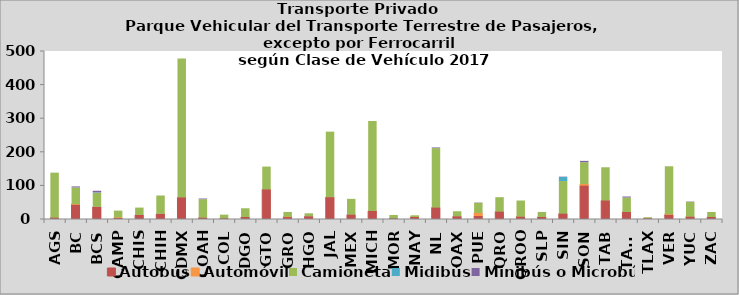
| Category | Autobús | Automóvil | Camioneta | Midibús | Minibús o Microbús |
|---|---|---|---|---|---|
| AGS | 4 | 0 | 134 | 0 | 0 |
| BC | 43 | 1 | 50 | 0 | 3 |
| BCS | 36 | 0 | 42 | 1 | 5 |
| CAMP | 3 | 2 | 20 | 0 | 0 |
| CHIS | 12 | 0 | 22 | 0 | 0 |
| CHIH | 15 | 0 | 55 | 0 | 0 |
| CDMX | 64 | 0 | 414 | 0 | 0 |
| COAH | 4 | 0 | 55 | 0 | 2 |
| COL | 2 | 0 | 11 | 0 | 0 |
| DGO | 6 | 0 | 26 | 0 | 0 |
| GTO | 88 | 0 | 68 | 0 | 0 |
| GRO | 6 | 1 | 14 | 0 | 0 |
| HGO | 8 | 0 | 9 | 0 | 0 |
| JAL | 65 | 0 | 195 | 0 | 0 |
| MEX | 13 | 0 | 47 | 0 | 0 |
| MICH | 24 | 0 | 268 | 0 | 0 |
| MOR | 2 | 0 | 10 | 0 | 0 |
| NAY | 6 | 0 | 5 | 0 | 0 |
| NL | 34 | 0 | 177 | 0 | 2 |
| OAX | 8 | 0 | 15 | 0 | 0 |
| PUE | 9 | 9 | 30 | 0 | 1 |
| QRO | 22 | 0 | 43 | 0 | 0 |
| QROO | 7 | 0 | 48 | 0 | 0 |
| SLP | 6 | 0 | 15 | 0 | 0 |
| SIN | 16 | 0 | 97 | 12 | 1 |
| SON | 100 | 4 | 65 | 0 | 4 |
| TAB | 55 | 0 | 99 | 0 | 0 |
| TAMS | 21 | 0 | 43 | 0 | 3 |
| TLAX | 2 | 0 | 3 | 0 | 0 |
| VER | 13 | 1 | 143 | 0 | 0 |
| YUC | 7 | 0 | 44 | 0 | 1 |
| ZAC | 6 | 0 | 15 | 0 | 0 |